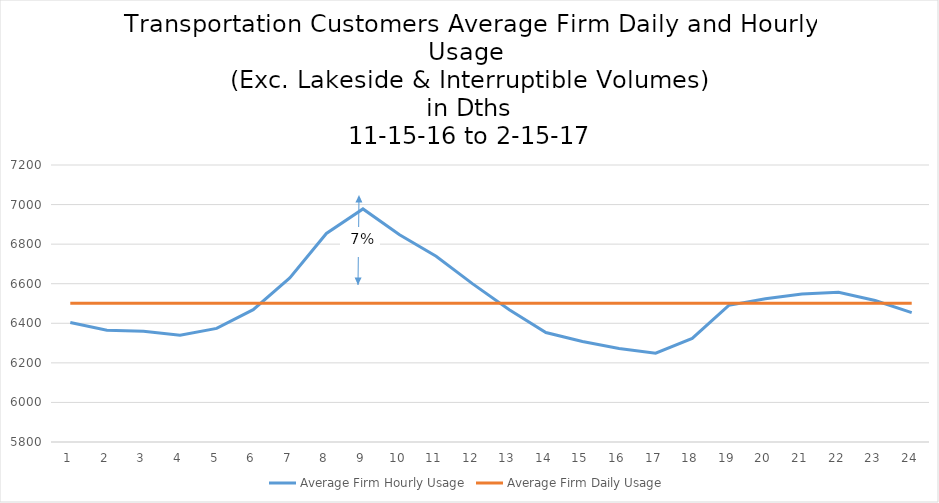
| Category | Average Firm Hourly Usage | Average Firm Daily Usage |
|---|---|---|
| 1.0 | 6403.516 | 6500.802 |
| 2.0 | 6364.602 | 6500.802 |
| 3.0 | 6359.763 | 6500.802 |
| 4.0 | 6339.968 | 6500.802 |
| 5.0 | 6374.226 | 6500.802 |
| 6.0 | 6469.043 | 6500.802 |
| 7.0 | 6628.839 | 6500.802 |
| 8.0 | 6854.022 | 6500.802 |
| 9.0 | 6977.925 | 6500.802 |
| 10.0 | 6847.484 | 6500.802 |
| 11.0 | 6739.054 | 6500.802 |
| 12.0 | 6599.086 | 6500.802 |
| 13.0 | 6468.183 | 6500.802 |
| 14.0 | 6353.409 | 6500.802 |
| 15.0 | 6307.538 | 6500.802 |
| 16.0 | 6272.215 | 6500.802 |
| 17.0 | 6249.065 | 6500.802 |
| 18.0 | 6323.495 | 6500.802 |
| 19.0 | 6490.71 | 6500.802 |
| 20.0 | 6523.796 | 6500.802 |
| 21.0 | 6547.624 | 6500.802 |
| 22.0 | 6557.097 | 6500.802 |
| 23.0 | 6515.043 | 6500.802 |
| 24.0 | 6453.548 | 6500.802 |